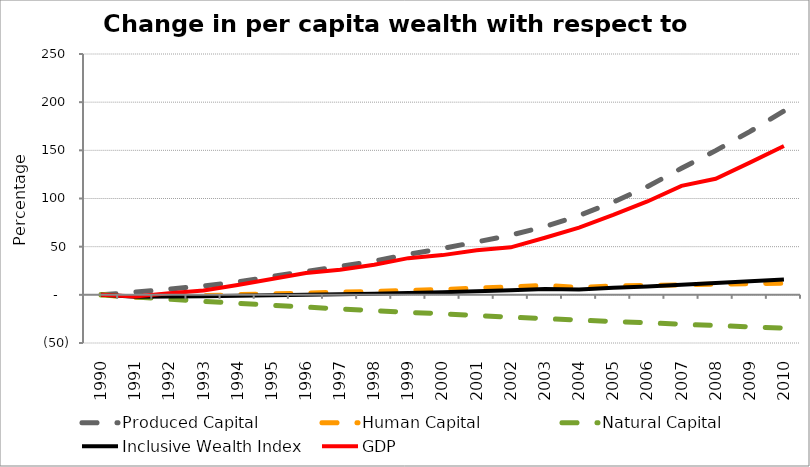
| Category | Produced Capital  | Human Capital | Natural Capital | Inclusive Wealth Index | GDP |
|---|---|---|---|---|---|
| 1990.0 | 0 | 0 | 0 | 0 | 0 |
| 1991.0 | 2.841 | -2.635 | -2.293 | -2.043 | -1.617 |
| 1992.0 | 5.974 | -1.754 | -4.544 | -1.794 | 1.646 |
| 1993.0 | 9.277 | -0.822 | -6.67 | -1.464 | 4.596 |
| 1994.0 | 13.348 | 0.142 | -8.747 | -1.03 | 10.247 |
| 1995.0 | 19.005 | 0.959 | -10.805 | -0.539 | 16.447 |
| 1996.0 | 24.334 | 1.818 | -12.732 | -0.018 | 22.759 |
| 1997.0 | 29.44 | 2.717 | -14.619 | 0.52 | 25.948 |
| 1998.0 | 35.132 | 3.643 | -16.407 | 1.156 | 31.141 |
| 1999.0 | 41.967 | 4.584 | -18.167 | 1.913 | 38.078 |
| 2000.0 | 48.197 | 5.526 | -19.647 | 2.689 | 41.239 |
| 2001.0 | 54.885 | 6.896 | -21.543 | 3.672 | 46.183 |
| 2002.0 | 61.982 | 8.286 | -23.149 | 4.781 | 49.277 |
| 2003.0 | 70.78 | 9.688 | -24.639 | 6.085 | 59.257 |
| 2004.0 | 82.386 | 7.736 | -26.157 | 5.487 | 69.843 |
| 2005.0 | 96.278 | 9.145 | -27.64 | 7.262 | 82.893 |
| 2006.0 | 112.356 | 9.774 | -29.056 | 8.755 | 96.915 |
| 2007.0 | 131.367 | 10.377 | -30.489 | 10.495 | 113.127 |
| 2008.0 | 149.678 | 10.958 | -31.868 | 12.171 | 120.467 |
| 2009.0 | 169.416 | 11.528 | -33.209 | 13.98 | 137.18 |
| 2010.0 | 190.796 | 12.089 | -34.584 | 15.924 | 154.511 |